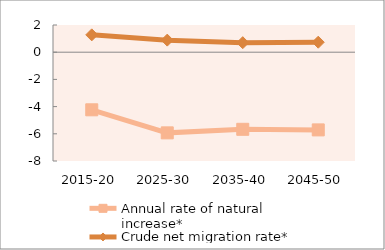
| Category | Annual rate of natural increase* | Crude net migration rate* |
|---|---|---|
| 2015-20 | -4.236 | 1.276 |
| 2025-30 | -5.931 | 0.887 |
| 2035-40 | -5.67 | 0.7 |
| 2045-50 | -5.713 | 0.735 |